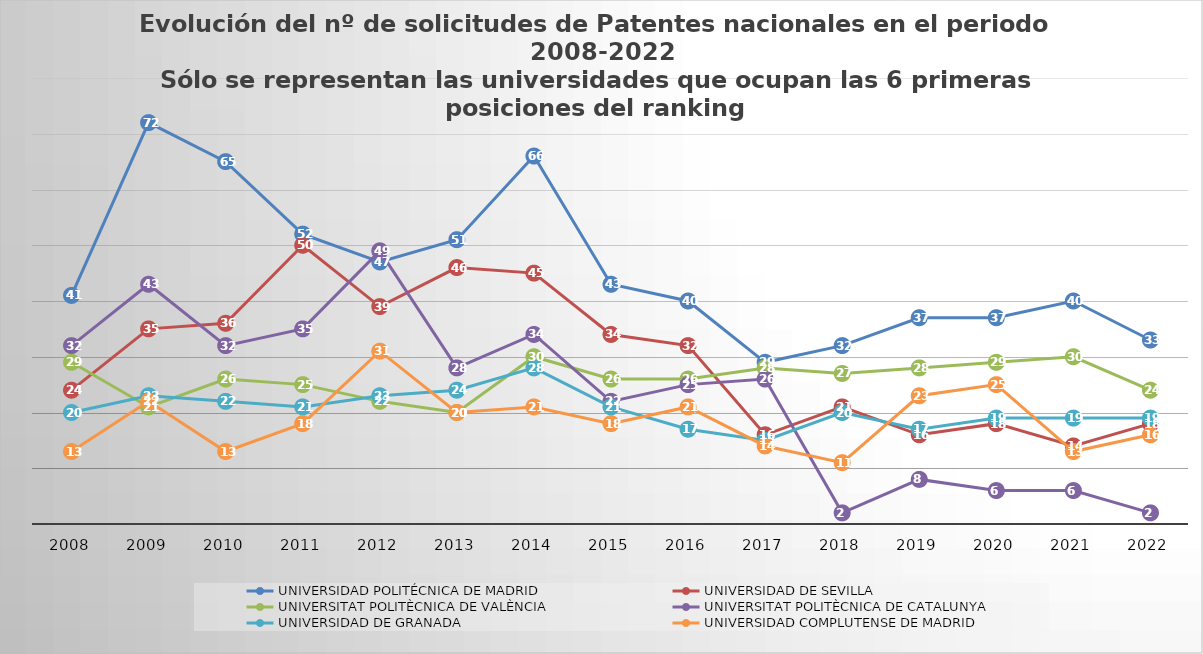
| Category | UNIVERSIDAD POLITÉCNICA DE MADRID | UNIVERSIDAD DE SEVILLA | UNIVERSITAT POLITÈCNICA DE VALÈNCIA | UNIVERSITAT POLITÈCNICA DE CATALUNYA | UNIVERSIDAD DE GRANADA | UNIVERSIDAD COMPLUTENSE DE MADRID |
|---|---|---|---|---|---|---|
| 2008 | 41 | 24 | 29 | 32 | 20 | 13 |
| 2009 | 72 | 35 | 21 | 43 | 23 | 22 |
| 2010 | 65 | 36 | 26 | 32 | 22 | 13 |
| 2011 | 52 | 50 | 25 | 35 | 21 | 18 |
| 2012 | 47 | 39 | 22 | 49 | 23 | 31 |
| 2013 | 51 | 46 | 20 | 28 | 24 | 20 |
| 2014 | 66 | 45 | 30 | 34 | 28 | 21 |
| 2015 | 43 | 34 | 26 | 22 | 21 | 18 |
| 2016 | 40 | 32 | 26 | 25 | 17 | 21 |
| 2017 | 29 | 16 | 28 | 26 | 15 | 14 |
| 2018 | 32 | 21 | 27 | 2 | 20 | 11 |
| 2019 | 37 | 16 | 28 | 8 | 17 | 23 |
| 2020 | 37 | 18 | 29 | 6 | 19 | 25 |
| 2021 | 40 | 14 | 30 | 6 | 19 | 13 |
| 2022 | 33 | 18 | 24 | 2 | 19 | 16 |